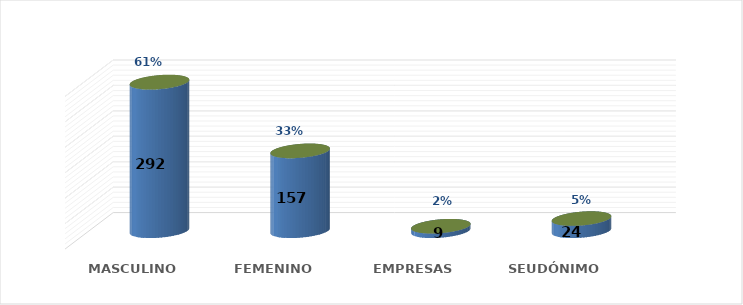
| Category | SOLICITUD POR GÉNERO | Series 1 |
|---|---|---|
| MASCULINO | 292 | 0.606 |
| FEMENINO | 157 | 0.326 |
| EMPRESAS | 9 | 0.019 |
| SEUDÓNIMO | 24 | 0.05 |